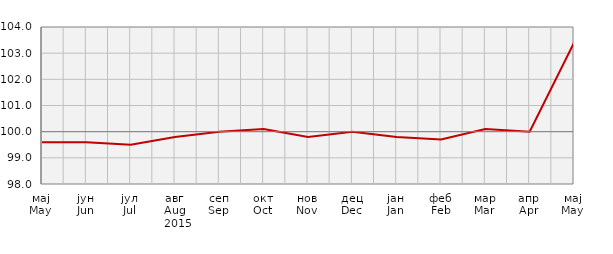
| Category | Индекси цијена произвођача
Producer price indices |
|---|---|
| мај
May | 99.6 |
| јун
Jun | 99.6 |
| јул
Jul | 99.5 |
| авг
Aug | 99.8 |
| сеп
Sep | 100 |
| окт
Oct | 100.1 |
| нов
Nov | 99.8 |
| дец
Dec | 100 |
| јан
Jan | 99.8 |
| феб
Feb | 99.7 |
| мар
Mar | 100.1 |
| апр
Apr | 100 |
| мај
May | 103.4 |